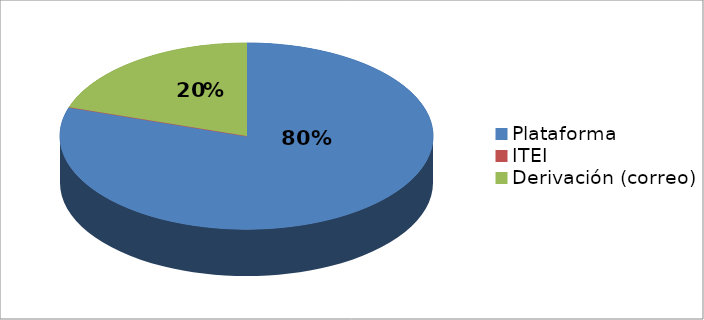
| Category | Series 0 | Series 1 |
|---|---|---|
| Plataforma | 4 | 0.8 |
| ITEI | 0 | 0 |
| Derivación (correo) | 1 | 0.2 |